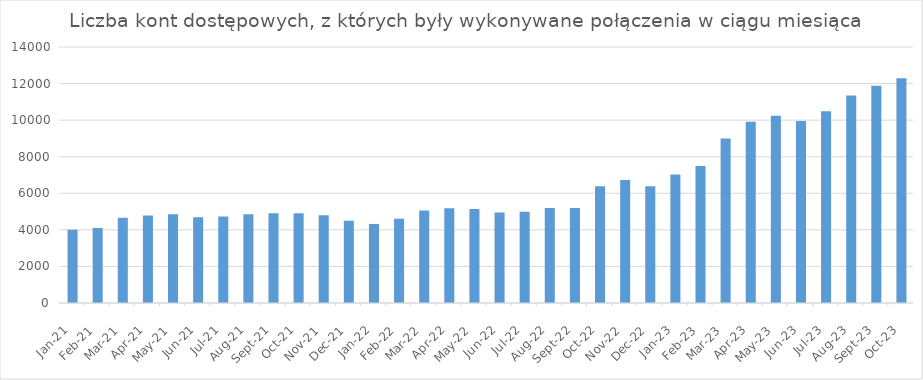
| Category | Series 0 |
|---|---|
| 2021-01-01 | 4009 |
| 2021-02-01 | 4103 |
| 2021-03-01 | 4657 |
| 2021-04-01 | 4787 |
| 2021-05-01 | 4848 |
| 2021-06-01 | 4683 |
| 2021-07-01 | 4734 |
| 2021-08-01 | 4850 |
| 2021-09-01 | 4911 |
| 2021-10-01 | 4915 |
| 2021-11-01 | 4796 |
| 2021-12-01 | 4501 |
| 2022-01-01 | 4323 |
| 2022-02-01 | 4610 |
| 2022-03-01 | 5054 |
| 2022-04-01 | 5183 |
| 2022-05-01 | 5147 |
| 2022-06-01 | 4956 |
| 2022-07-01 | 4986 |
| 2022-08-01 | 5191 |
| 2022-09-01 | 5200 |
| 2022-10-01 | 6389 |
| 2022-11-01 | 6723 |
| 2022-12-01 | 6386 |
| 2023-01-01 | 7028 |
| 2023-02-01 | 7486 |
| 2023-03-01 | 8997 |
| 2023-04-01 | 9913 |
| 2023-05-01 | 10245 |
| 2023-06-01 | 9955 |
| 2023-07-01 | 10482 |
| 2023-08-01 | 11341 |
| 2023-09-01 | 11878 |
| 2023-10-01 | 12289 |